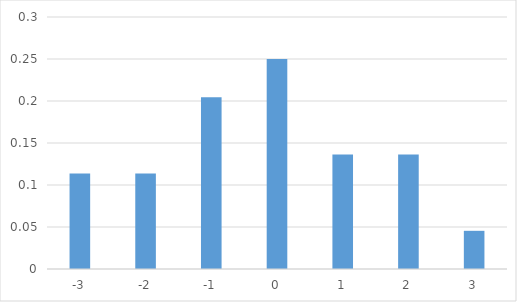
| Category | Series 0 |
|---|---|
| -3.0 | 0.114 |
| -2.0 | 0.114 |
| -1.0 | 0.205 |
| 0.0 | 0.25 |
| 1.0 | 0.136 |
| 2.0 | 0.136 |
| 3.0 | 0.045 |